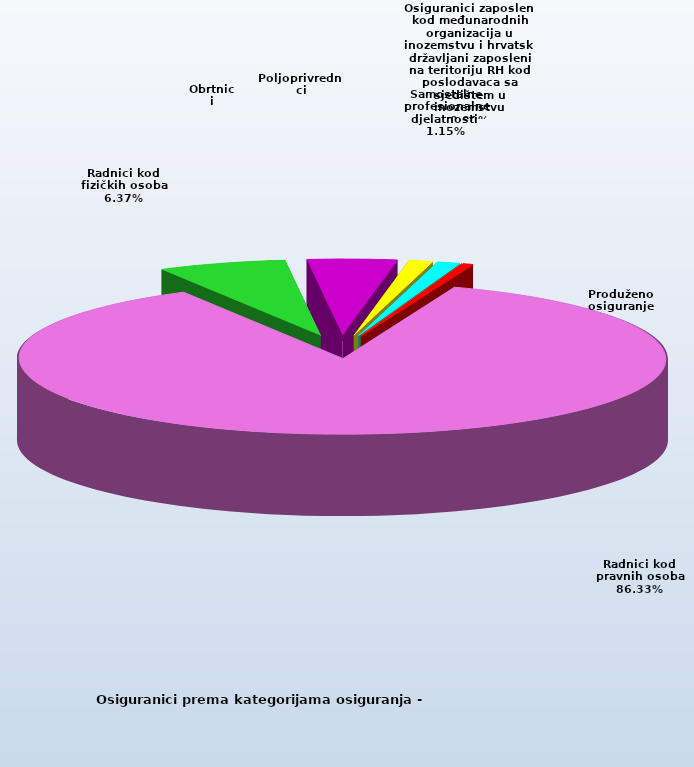
| Category | Series 0 |
|---|---|
| Radnici kod pravnih osoba | 1354404 |
| Radnici kod fizičkih osoba | 99952 |
| Obrtnici | 69815 |
| Poljoprivrednici | 18717 |
| Samostalne profesionalne djelatnosti  | 17984 |
| Osiguranici zaposleni kod međunarodnih organizacija u inozemstvu i hrvatski državljani zaposleni na teritoriju RH kod poslodavaca sa sjedištem u inozemstvu | 66 |
| Produženo osiguranje | 7989 |